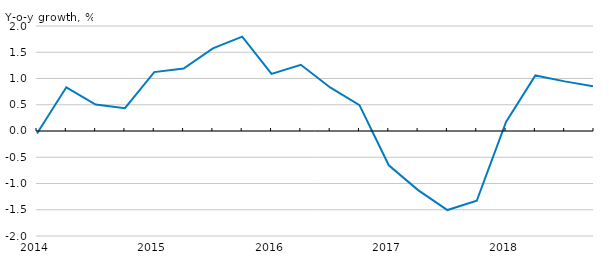
| Category | Series 0 |
|---|---|
| 2014.0 | -0.048 |
| nan | 0.832 |
| nan | 0.505 |
| nan | 0.436 |
| 2015.0 | 1.122 |
| nan | 1.189 |
| nan | 1.574 |
| nan | 1.798 |
| 2016.0 | 1.087 |
| nan | 1.262 |
| nan | 0.829 |
| nan | 0.493 |
| 2017.0 | -0.653 |
| nan | -1.126 |
| nan | -1.506 |
| nan | -1.329 |
| 2018.0 | 0.174 |
| nan | 1.059 |
| nan | 0.945 |
| nan | 0.851 |